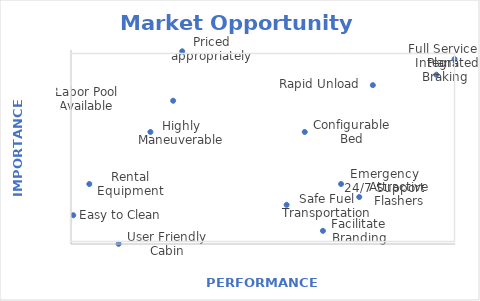
| Category | "How important is this need to you?”  |
|---|---|
| 8.133333333333333 | 8.067 |
| 6.466666666666667 | 4.867 |
| 2.769230769230769 | 4.867 |
| 4.0 | 7 |
| 3.2 | 3.333 |
| 3.6666666666666665 | 6.2 |
| 7.866666666666666 | 7.667 |
| 6.733333333333333 | 4.533 |
| 6.2 | 3.667 |
| 6.933333333333334 | 7.4 |
| 5.666666666666667 | 4.333 |
| 5.933333333333334 | 6.2 |
| 4.133333333333334 | 8.267 |
| 2.533333333333333 | 4.067 |